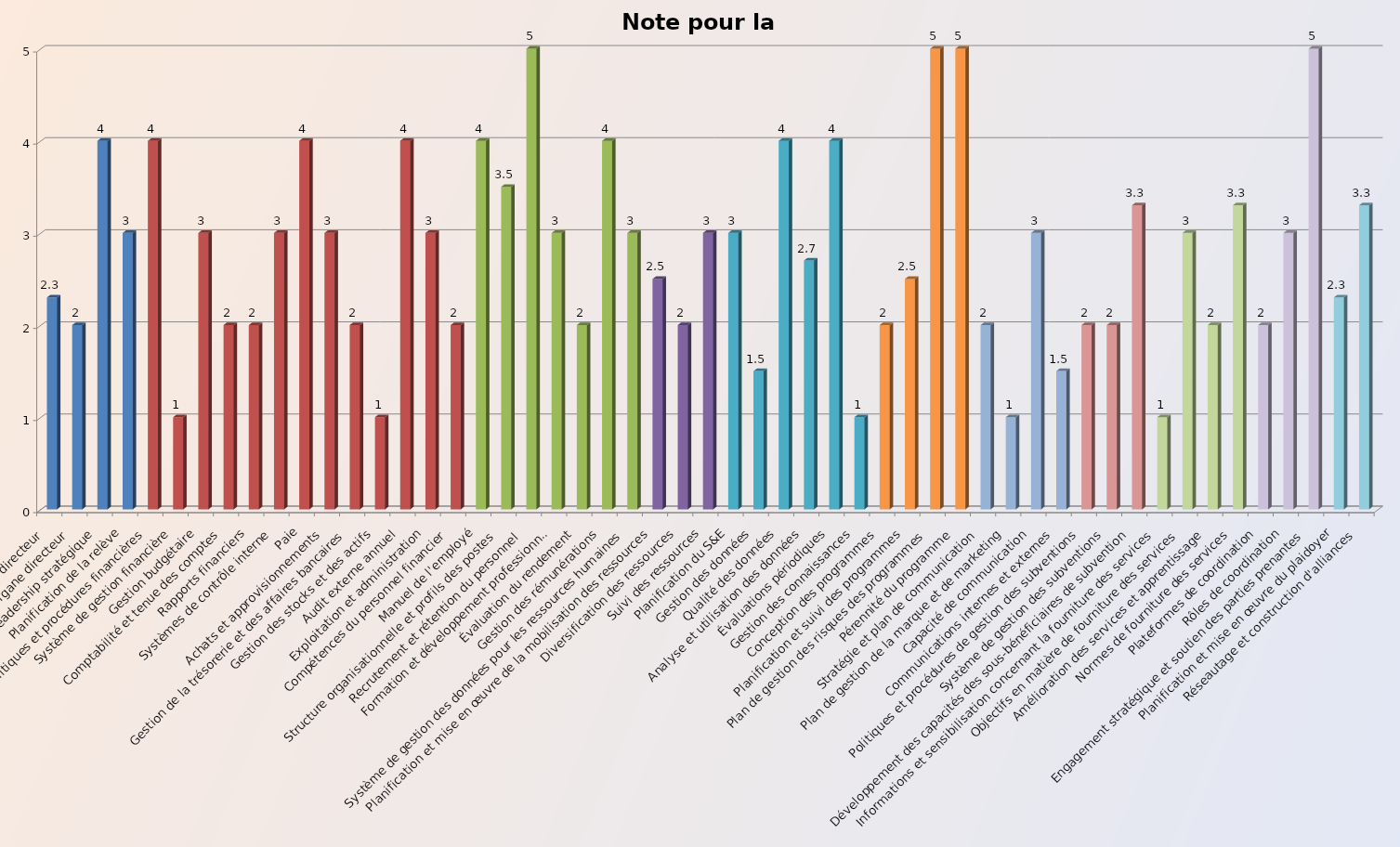
| Category | Note pour la catégorie |
|---|---|
| Constitution de l'organe directeur | 2.3 |
| Fonction de l'organe directeur | 2 |
| Leadership stratégique | 4 |
| Planification de la relève | 3 |
| Politiques et procédures financières | 4 |
| Système de gestion financière | 1 |
| Gestion budgétaire | 3 |
| Comptabilité et tenue des comptes | 2 |
| Rapports financiers | 2 |
| Systèmes de contrôle interne | 3 |
| Paie | 4 |
| Achats et approvisionnements | 3 |
| Gestion de la trésorerie et des affaires bancaires | 2 |
| Gestion des stocks et des actifs | 1 |
| Audit externe annuel | 4 |
| Exploitation et administration | 3 |
| Compétences du personnel financier | 2 |
| Manuel de l'employé  | 4 |
| Structure organisationnelle et profils des postes | 3.5 |
| Recrutement et rétention du personnel | 5 |
| Formation et développement professionnel | 3 |
| Évaluation du rendement | 2 |
| Gestion des rémunérations | 4 |
| Système de gestion des données pour les ressources humaines | 3 |
| Planification et mise en œuvre de la mobilisation des ressources | 2.5 |
| Diversification des ressources | 2 |
| Suivi des ressources | 3 |
| Planification du S&E | 3 |
| Gestion des données | 1.5 |
| Qualité des données | 4 |
| Analyse et utilisation des données | 2.7 |
| Évaluations périodiques | 4 |
| Gestion des connaissances | 1 |
| Conception des programmes | 2 |
| Planification et suivi des programmes | 2.5 |
| Plan de gestion des risques des programmes | 5 |
| Pérennité du programme | 5 |
| Stratégie et plan de communication | 2 |
| Plan de gestion de la marque et de marketing | 1 |
| Capacité de communication | 3 |
| Communications internes et externes | 1.5 |
| Politiques et procédures de gestion des subventions | 2 |
| Système de gestion des subventions | 2 |
| Développement des capacités des sous-bénéficiaires de subvention | 3.3 |
| Informations et sensibilisation concernant la fourniture des services | 1 |
| Objectifs en matière de fourniture des services | 3 |
| Amélioration des services et apprentissage | 2 |
| Normes de fourniture des services | 3.3 |
| Plateformes de coordination | 2 |
| Rôles de coordination | 3 |
| Engagement stratégique et soutien des parties prenantes | 5 |
| Planification et mise en œuvre du plaidoyer | 2.3 |
| Réseautage et construction d'alliances | 3.3 |